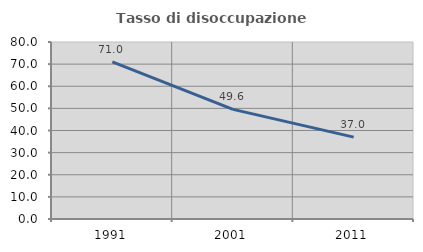
| Category | Tasso di disoccupazione giovanile  |
|---|---|
| 1991.0 | 70.975 |
| 2001.0 | 49.564 |
| 2011.0 | 37.01 |